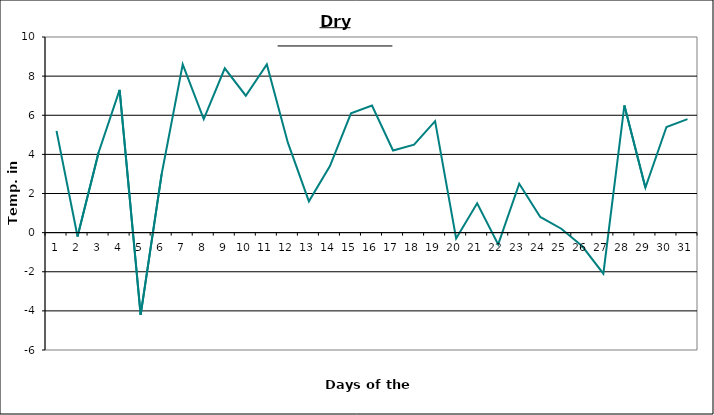
| Category | Series 0 |
|---|---|
| 0 | 5.2 |
| 1 | -0.2 |
| 2 | 4.1 |
| 3 | 7.3 |
| 4 | -4.2 |
| 5 | 3 |
| 6 | 8.6 |
| 7 | 5.8 |
| 8 | 8.4 |
| 9 | 7 |
| 10 | 8.6 |
| 11 | 4.6 |
| 12 | 1.6 |
| 13 | 3.4 |
| 14 | 6.1 |
| 15 | 6.5 |
| 16 | 4.2 |
| 17 | 4.5 |
| 18 | 5.7 |
| 19 | -0.3 |
| 20 | 1.5 |
| 21 | -0.6 |
| 22 | 2.5 |
| 23 | 0.8 |
| 24 | 0.2 |
| 25 | -0.7 |
| 26 | -2.1 |
| 27 | 6.5 |
| 28 | 2.3 |
| 29 | 5.4 |
| 30 | 5.8 |